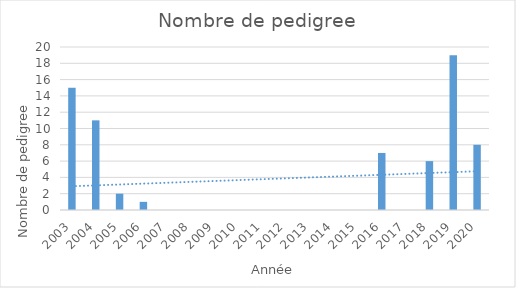
| Category | Series 0 |
|---|---|
| 2003.0 | 15 |
| 2004.0 | 11 |
| 2005.0 | 2 |
| 2006.0 | 1 |
| 2007.0 | 0 |
| 2008.0 | 0 |
| 2009.0 | 0 |
| 2010.0 | 0 |
| 2011.0 | 0 |
| 2012.0 | 0 |
| 2013.0 | 0 |
| 2014.0 | 0 |
| 2015.0 | 0 |
| 2016.0 | 7 |
| 2017.0 | 0 |
| 2018.0 | 6 |
| 2019.0 | 19 |
| 2020.0 | 8 |